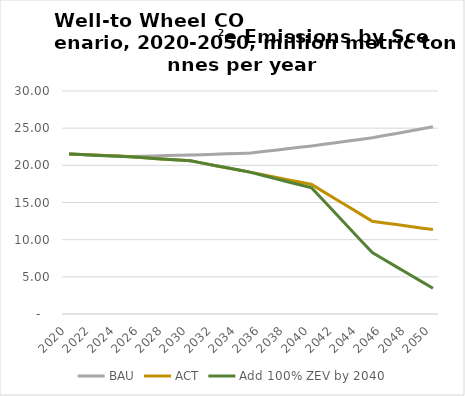
| Category | BAU | ACT | Add 100% ZEV by 2040 |
|---|---|---|---|
| 2020.0 | 21.515 | 21.515 | 21.515 |
| 2021.0 | 21.452 | 21.452 | 21.442 |
| 2022.0 | 21.389 | 21.389 | 21.369 |
| 2023.0 | 21.327 | 21.327 | 21.296 |
| 2024.0 | 21.264 | 21.264 | 21.223 |
| 2025.0 | 21.202 | 21.15 | 21.15 |
| 2026.0 | 21.237 | 21.042 | 21.042 |
| 2027.0 | 21.272 | 20.934 | 20.934 |
| 2028.0 | 21.307 | 20.826 | 20.826 |
| 2029.0 | 21.342 | 20.718 | 20.718 |
| 2030.0 | 21.377 | 20.61 | 20.61 |
| 2031.0 | 21.434 | 20.298 | 20.298 |
| 2032.0 | 21.491 | 19.986 | 19.986 |
| 2033.0 | 21.549 | 19.674 | 19.674 |
| 2034.0 | 21.606 | 19.362 | 19.362 |
| 2035.0 | 21.663 | 19.05 | 19.05 |
| 2036.0 | 21.853 | 18.724 | 18.633 |
| 2037.0 | 22.042 | 18.398 | 18.216 |
| 2038.0 | 22.232 | 18.072 | 17.798 |
| 2039.0 | 22.421 | 17.746 | 17.381 |
| 2040.0 | 22.611 | 17.42 | 16.964 |
| 2041.0 | 22.83 | 16.432 | 15.222 |
| 2042.0 | 23.048 | 15.444 | 13.481 |
| 2043.0 | 23.267 | 14.456 | 11.74 |
| 2044.0 | 23.486 | 13.467 | 9.999 |
| 2045.0 | 23.704 | 12.479 | 8.257 |
| 2046.0 | 24 | 12.255 | 7.3 |
| 2047.0 | 24.296 | 12.03 | 6.343 |
| 2048.0 | 24.592 | 11.805 | 5.385 |
| 2049.0 | 24.887 | 11.58 | 4.428 |
| 2050.0 | 25.183 | 11.355 | 3.471 |